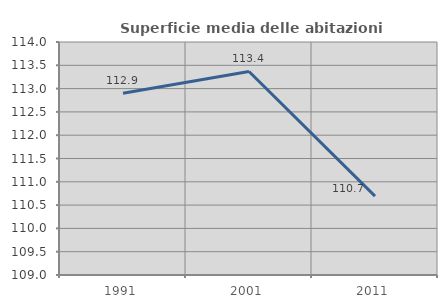
| Category | Superficie media delle abitazioni occupate |
|---|---|
| 1991.0 | 112.901 |
| 2001.0 | 113.367 |
| 2011.0 | 110.694 |